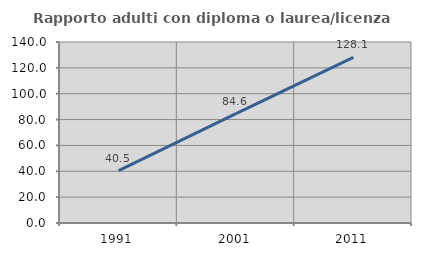
| Category | Rapporto adulti con diploma o laurea/licenza media  |
|---|---|
| 1991.0 | 40.496 |
| 2001.0 | 84.553 |
| 2011.0 | 128.125 |